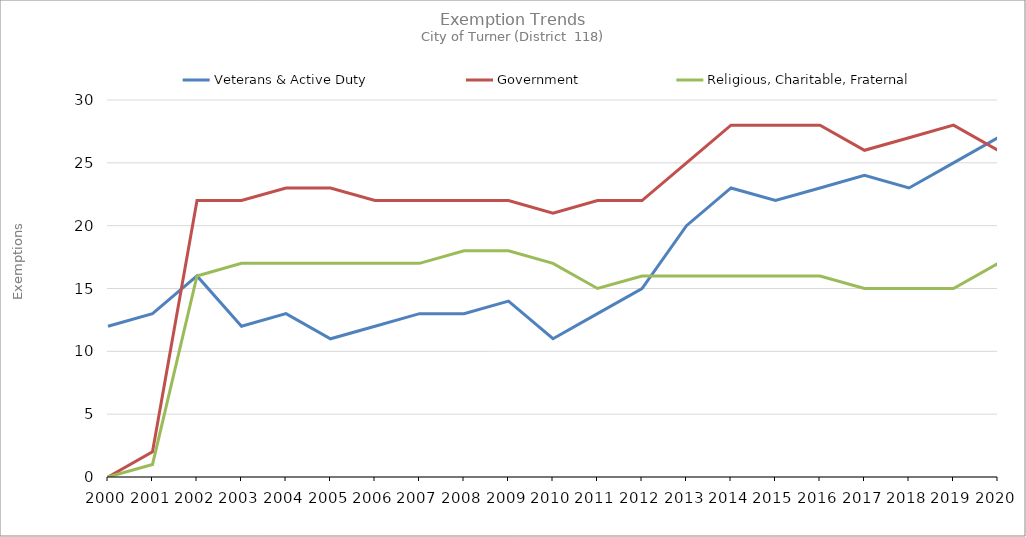
| Category | Veterans & Active Duty | Government | Religious, Charitable, Fraternal |
|---|---|---|---|
| 2000.0 | 12 | 0 | 0 |
| 2001.0 | 13 | 2 | 1 |
| 2002.0 | 16 | 22 | 16 |
| 2003.0 | 12 | 22 | 17 |
| 2004.0 | 13 | 23 | 17 |
| 2005.0 | 11 | 23 | 17 |
| 2006.0 | 12 | 22 | 17 |
| 2007.0 | 13 | 22 | 17 |
| 2008.0 | 13 | 22 | 18 |
| 2009.0 | 14 | 22 | 18 |
| 2010.0 | 11 | 21 | 17 |
| 2011.0 | 13 | 22 | 15 |
| 2012.0 | 15 | 22 | 16 |
| 2013.0 | 20 | 25 | 16 |
| 2014.0 | 23 | 28 | 16 |
| 2015.0 | 22 | 28 | 16 |
| 2016.0 | 23 | 28 | 16 |
| 2017.0 | 24 | 26 | 15 |
| 2018.0 | 23 | 27 | 15 |
| 2019.0 | 25 | 28 | 15 |
| 2020.0 | 27 | 26 | 17 |